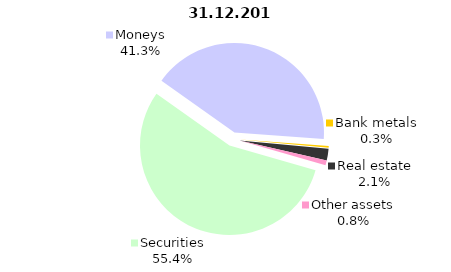
| Category | Total |
|---|---|
| Securities | 887.645 |
| Moneys | 662.762 |
| Bank metals | 4.975 |
| Real estate | 34.35 |
| Other assets | 13.421 |